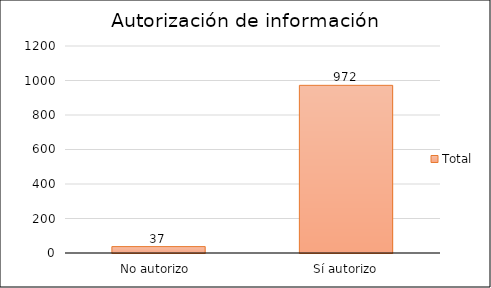
| Category | Total |
|---|---|
| No autorizo  | 37 |
| Sí autorizo | 972 |